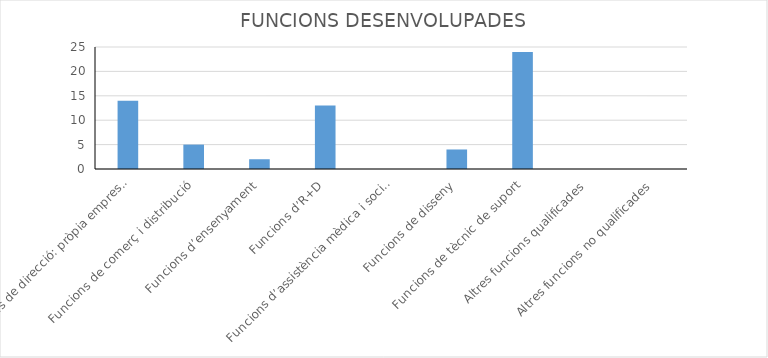
| Category | Series 0 |
|---|---|
| Funcions de direcció: pròpia empresa, direcció, producció, financera, etc. | 14 |
| Funcions de comerç i distribució | 5 |
| Funcions d’ensenyament | 2 |
| Funcions d’R+D | 13 |
| Funcions d’assistència mèdica i social | 0 |
| Funcions de disseny | 4 |
| Funcions de tècnic de suport | 24 |
| Altres funcions qualificades | 0 |
| Altres funcions no qualificades | 0 |